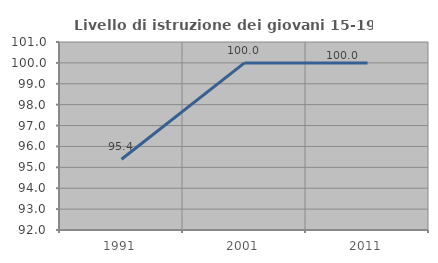
| Category | Livello di istruzione dei giovani 15-19 anni |
|---|---|
| 1991.0 | 95.385 |
| 2001.0 | 100 |
| 2011.0 | 100 |